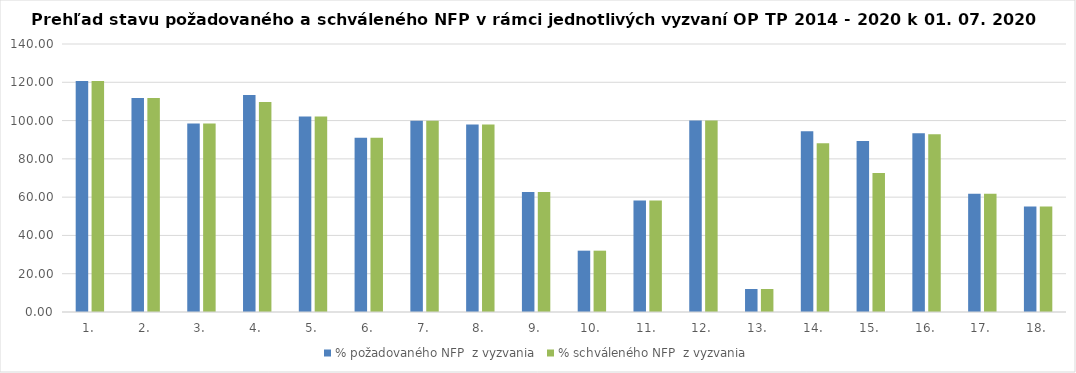
| Category | % požadovaného NFP  z vyzvania | % schváleného NFP  z vyzvania |
|---|---|---|
| 1. | 120.662 | 120.662 |
| 2. | 111.83 | 111.83 |
| 3. | 98.465 | 98.465 |
| 4. | 113.295 | 109.758 |
| 5. | 102.19 | 102.19 |
| 6. | 91.016 | 91.016 |
| 7. | 99.954 | 99.954 |
| 8. | 97.989 | 97.989 |
| 9. | 62.721 | 62.721 |
| 10. | 32.038 | 32.038 |
| 11. | 58.283 | 58.283 |
| 12. | 99.995 | 99.995 |
| 13. | 12.008 | 12.008 |
| 14. | 94.372 | 88.129 |
| 15. | 89.393 | 72.557 |
| 16. | 93.316 | 92.892 |
| 17. | 61.754 | 61.754 |
| 18. | 55.063 | 55.063 |